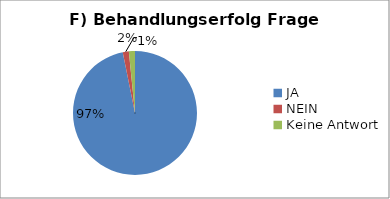
| Category | Series 0 |
|---|---|
| JA | 122 |
| NEIN | 2 |
| Keine Antwort | 2 |